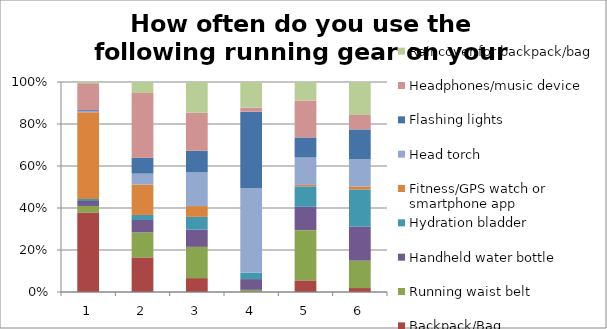
| Category | Backpack/Bag | Running waist belt | Handheld water bottle | Hydration bladder | Fitness/GPS watch or smartphone app | Head torch | Flashing lights | Headphones/music device | Raincover for backpack/bag |
|---|---|---|---|---|---|---|---|---|---|
| 0 | 0.729 | 0.061 | 0.046 | 0.019 | 0.796 | 0.007 | 0.011 | 0.247 | 0.011 |
| 1 | 0.106 | 0.076 | 0.038 | 0.015 | 0.093 | 0.033 | 0.049 | 0.197 | 0.034 |
| 2 | 0.046 | 0.103 | 0.057 | 0.042 | 0.036 | 0.111 | 0.071 | 0.125 | 0.102 |
| 3 | 0 | 0.004 | 0.019 | 0.012 | 0 | 0.148 | 0.135 | 0.007 | 0.045 |
| 4 | 0.028 | 0.122 | 0.057 | 0.05 | 0.004 | 0.067 | 0.049 | 0.09 | 0.045 |
| 5 | 0.092 | 0.634 | 0.784 | 0.863 | 0.071 | 0.633 | 0.685 | 0.333 | 0.763 |